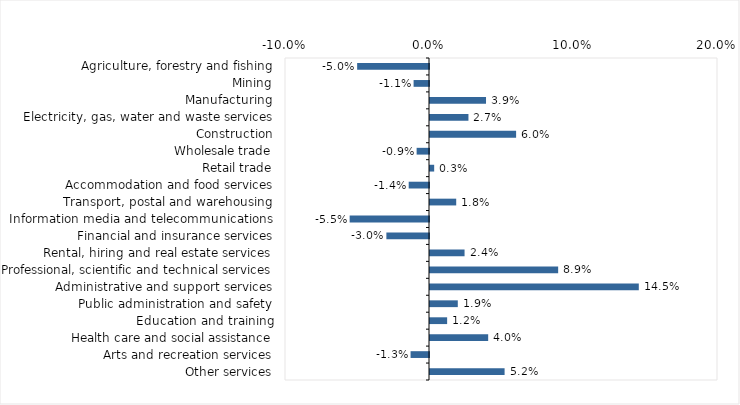
| Category | This week |
|---|---|
| Agriculture, forestry and fishing | -0.05 |
| Mining | -0.011 |
| Manufacturing | 0.039 |
| Electricity, gas, water and waste services | 0.027 |
| Construction | 0.06 |
| Wholesale trade | -0.009 |
| Retail trade | 0.003 |
| Accommodation and food services | -0.014 |
| Transport, postal and warehousing | 0.018 |
| Information media and telecommunications | -0.055 |
| Financial and insurance services | -0.03 |
| Rental, hiring and real estate services | 0.024 |
| Professional, scientific and technical services | 0.089 |
| Administrative and support services | 0.145 |
| Public administration and safety | 0.019 |
| Education and training | 0.012 |
| Health care and social assistance | 0.04 |
| Arts and recreation services | -0.013 |
| Other services | 0.052 |